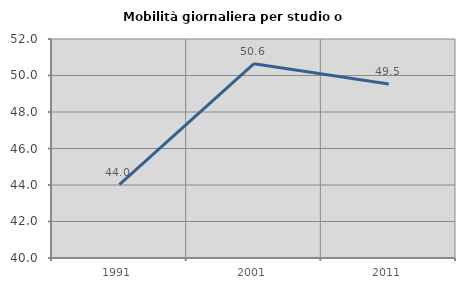
| Category | Mobilità giornaliera per studio o lavoro |
|---|---|
| 1991.0 | 44.015 |
| 2001.0 | 50.647 |
| 2011.0 | 49.533 |